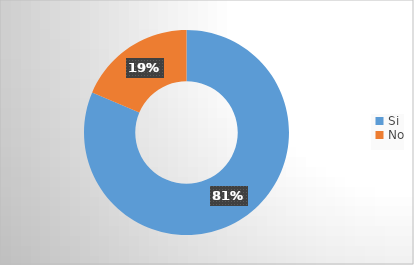
| Category | Series 0 |
|---|---|
| Si | 0.814 |
| No | 0.186 |